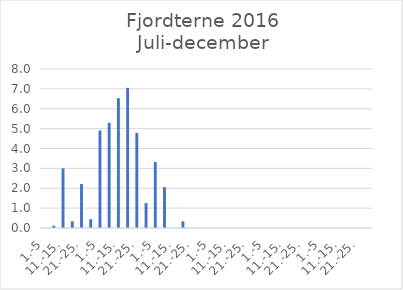
| Category | Series 0 |
|---|---|
| 1.-5 | 0 |
| 6.-10. | 0.116 |
| 11.-15. | 3 |
| 16.-20. | 0.34 |
| 21.-25. | 2.21 |
| 26.-31. | 0.44 |
| 1.-5 | 4.908 |
| 6.-10. | 5.294 |
| 11.-15. | 6.532 |
| 16.-20. | 7.049 |
| 21.-25. | 4.786 |
| 26.-31. | 1.251 |
| 1.-5 | 3.316 |
| 6.-10. | 2.056 |
| 11.-15. | 0 |
| 16.-20. | 0.336 |
| 21.-25. | 0 |
| 26.-30. | 0 |
| 1.-5 | 0 |
| 6.-10. | 0 |
| 11.-15. | 0 |
| 16.-20. | 0 |
| 21.-25. | 0 |
| 26.-31. | 0 |
| 1.-5 | 0 |
| 6.-10. | 0 |
| 11.-15. | 0 |
| 16.-20. | 0 |
| 21.-25. | 0 |
| 26.-30. | 0 |
| 1.-5 | 0 |
| 6.-10. | 0 |
| 11.-15. | 0 |
| 16.-20. | 0 |
| 21.-25. | 0 |
| 26.-31. | 0 |